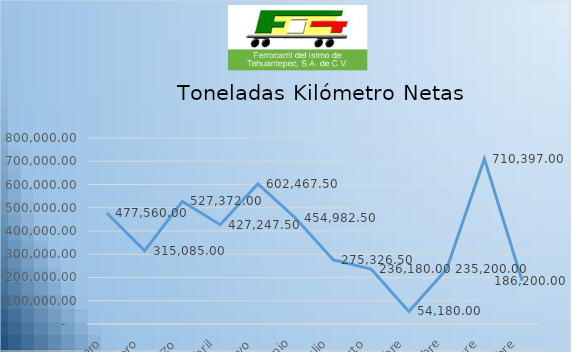
| Category | Series 0 |
|---|---|
| Enero | 477560 |
| Febrero | 315085 |
| Marzo | 527372 |
| Abril | 427247.5 |
| Mayo | 602467.5 |
| Junio | 454982.5 |
| Julio | 275326.5 |
| Agosto | 236180 |
| Septiembre | 54180 |
| Octubre | 235200 |
| Noviembre | 710397 |
| Diciembre | 186200 |